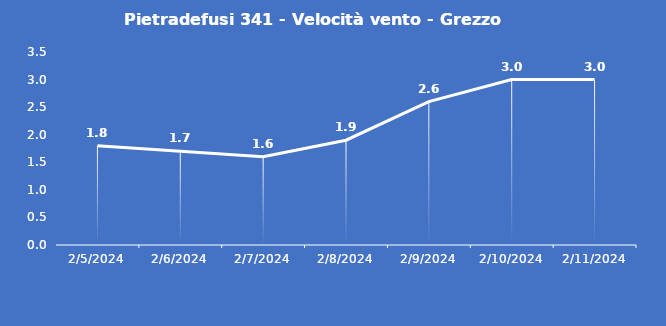
| Category | Pietradefusi 341 - Velocità vento - Grezzo (m/s) |
|---|---|
| 2/5/24 | 1.8 |
| 2/6/24 | 1.7 |
| 2/7/24 | 1.6 |
| 2/8/24 | 1.9 |
| 2/9/24 | 2.6 |
| 2/10/24 | 3 |
| 2/11/24 | 3 |